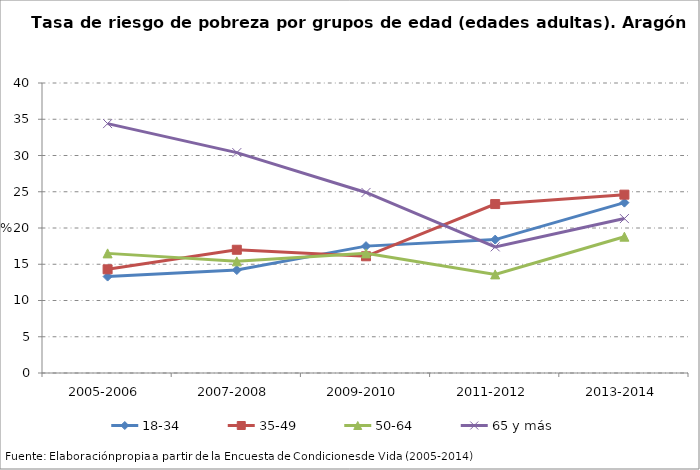
| Category | 18-34 | 35-49 | 50-64 | 65 y más |
|---|---|---|---|---|
| 2005-2006 | 13.3 | 14.3 | 16.5 | 34.4 |
| 2007-2008 | 14.2 | 17 | 15.4 | 30.4 |
| 2009-2010 | 17.5 | 16.1 | 16.5 | 24.9 |
| 2011-2012 | 18.4 | 23.3 | 13.6 | 17.4 |
| 2013-2014 | 23.5 | 24.6 | 18.8 | 21.3 |